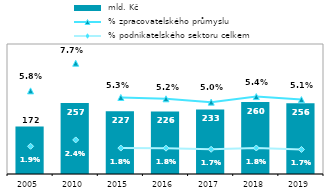
| Category |  mld. Kč |
|---|---|
| 2005.0 | 172.086 |
| 2010.0 | 256.64 |
| 2015.0 | 226.828 |
| 2016.0 | 226.336 |
| 2017.0 | 233.272 |
| 2018.0 | 260.301 |
| 2019.0 | 256.181 |